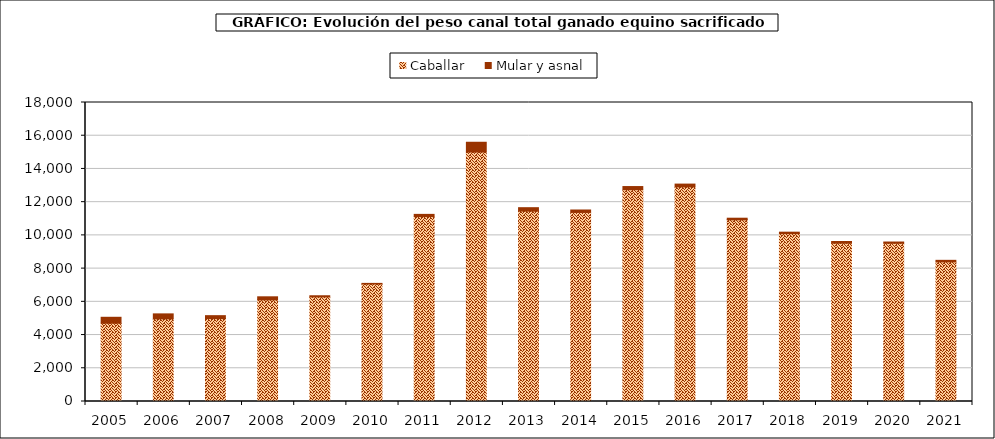
| Category | Caballar | Mular y asnal |
|---|---|---|
| 2005.0 | 4710.606 | 359.156 |
| 2006.0 | 4973.651 | 301.565 |
| 2007.0 | 4990.288 | 177.685 |
| 2008.0 | 6117.007 | 185.894 |
| 2009.0 | 6294.766 | 70.94 |
| 2010.0 | 7071.719 | 39.187 |
| 2011.0 | 11131.436 | 133.748 |
| 2012.0 | 15015.542 | 590.926 |
| 2013.0 | 11460.028 | 207.903 |
| 2014.0 | 11383.677 | 145.218 |
| 2015.0 | 12751.613 | 188.71 |
| 2016.0 | 12918.364 | 169.795 |
| 2017.0 | 10935.175 | 99.182 |
| 2018.0 | 10105.017 | 88.917 |
| 2019.0 | 9527.182 | 104.573 |
| 2020.0 | 9523.49 | 77.668 |
| 2021.0 | 8403.192 | 95.166 |